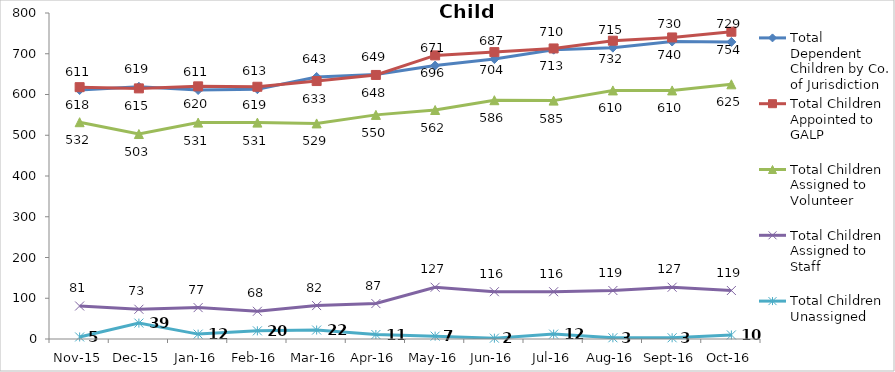
| Category | Total Dependent Children by Co. of Jurisdiction | Total Children Appointed to GALP | Total Children Assigned to Volunteer | Total Children Assigned to Staff | Total Children Unassigned |
|---|---|---|---|---|---|
| Nov-15 | 611 | 618 | 532 | 81 | 5 |
| Dec-15 | 619 | 615 | 503 | 73 | 39 |
| Jan-16 | 611 | 620 | 531 | 77 | 12 |
| Feb-16 | 613 | 619 | 531 | 68 | 20 |
| Mar-16 | 643 | 633 | 529 | 82 | 22 |
| Apr-16 | 649 | 648 | 550 | 87 | 11 |
| May-16 | 671 | 696 | 562 | 127 | 7 |
| Jun-16 | 687 | 704 | 586 | 116 | 2 |
| Jul-16 | 710 | 713 | 585 | 116 | 12 |
| Aug-16 | 715 | 732 | 610 | 119 | 3 |
| Sep-16 | 730 | 740 | 610 | 127 | 3 |
| Oct-16 | 729 | 754 | 625 | 119 | 10 |